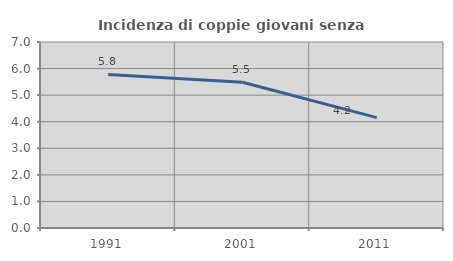
| Category | Incidenza di coppie giovani senza figli |
|---|---|
| 1991.0 | 5.778 |
| 2001.0 | 5.486 |
| 2011.0 | 4.154 |